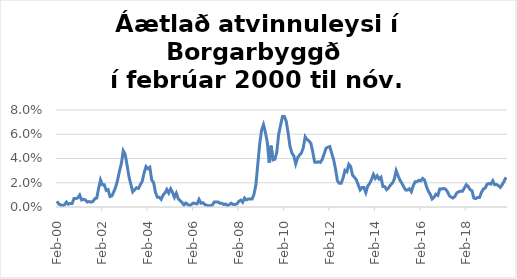
| Category | Series 0 |
|---|---|
| 2000-02-01 | 0.005 |
| 2000-03-01 | 0.002 |
| 2000-04-01 | 0.002 |
| 2000-05-01 | 0.001 |
| 2000-06-01 | 0.002 |
| 2000-07-01 | 0.004 |
| 2000-08-01 | 0.002 |
| 2000-09-01 | 0.003 |
| 2000-10-01 | 0.003 |
| 2000-11-01 | 0.007 |
| 2000-12-01 | 0.007 |
| 2001-01-01 | 0.008 |
| 2001-02-01 | 0.01 |
| 2001-03-01 | 0.006 |
| 2001-04-01 | 0.006 |
| 2001-05-01 | 0.006 |
| 2001-06-01 | 0.004 |
| 2001-07-01 | 0.005 |
| 2001-08-01 | 0.004 |
| 2001-09-01 | 0.005 |
| 2001-10-01 | 0.007 |
| 2001-11-01 | 0.007 |
| 2001-12-01 | 0.015 |
| 2002-01-01 | 0.022 |
| 2002-02-01 | 0.018 |
| 2002-03-01 | 0.018 |
| 2002-04-01 | 0.014 |
| 2002-05-01 | 0.014 |
| 2002-06-01 | 0.009 |
| 2002-07-01 | 0.009 |
| 2002-08-01 | 0.013 |
| 2002-09-01 | 0.017 |
| 2002-10-01 | 0.022 |
| 2002-11-01 | 0.03 |
| 2002-12-01 | 0.036 |
| 2003-01-01 | 0.046 |
| 2003-02-01 | 0.043 |
| 2003-03-01 | 0.035 |
| 2003-04-01 | 0.025 |
| 2003-05-01 | 0.019 |
| 2003-06-01 | 0.013 |
| 2003-07-01 | 0.014 |
| 2003-08-01 | 0.016 |
| 2003-09-01 | 0.015 |
| 2003-10-01 | 0.018 |
| 2003-11-01 | 0.021 |
| 2003-12-01 | 0.028 |
| 2004-01-01 | 0.033 |
| 2004-02-01 | 0.032 |
| 2004-03-01 | 0.033 |
| 2004-04-01 | 0.022 |
| 2004-05-01 | 0.02 |
| 2004-06-01 | 0.012 |
| 2004-07-01 | 0.008 |
| 2004-08-01 | 0.008 |
| 2004-09-01 | 0.006 |
| 2004-10-01 | 0.01 |
| 2004-11-01 | 0.012 |
| 2004-12-01 | 0.014 |
| 2005-01-01 | 0.012 |
| 2005-02-01 | 0.015 |
| 2005-03-01 | 0.012 |
| 2005-04-01 | 0.008 |
| 2005-05-01 | 0.011 |
| 2005-06-01 | 0.007 |
| 2005-07-01 | 0.005 |
| 2005-08-01 | 0.004 |
| 2005-09-01 | 0.002 |
| 2005-10-01 | 0.003 |
| 2005-11-01 | 0.002 |
| 2005-12-01 | 0.001 |
| 2006-01-01 | 0.002 |
| 2006-02-01 | 0.003 |
| 2006-03-01 | 0.003 |
| 2006-04-01 | 0.003 |
| 2006-05-01 | 0.006 |
| 2006-06-01 | 0.003 |
| 2006-07-01 | 0.004 |
| 2006-08-01 | 0.002 |
| 2006-09-01 | 0.002 |
| 2006-10-01 | 0.001 |
| 2006-11-01 | 0.001 |
| 2006-12-01 | 0.002 |
| 2007-01-01 | 0.004 |
| 2007-02-01 | 0.004 |
| 2007-03-01 | 0.004 |
| 2007-04-01 | 0.003 |
| 2007-05-01 | 0.003 |
| 2007-06-01 | 0.002 |
| 2007-07-01 | 0.003 |
| 2007-08-01 | 0.001 |
| 2007-09-01 | 0.002 |
| 2007-10-01 | 0.003 |
| 2007-11-01 | 0.002 |
| 2007-12-01 | 0.002 |
| 2008-01-01 | 0.003 |
| 2008-02-01 | 0.005 |
| 2008-03-01 | 0.006 |
| 2008-04-01 | 0.004 |
| 2008-05-01 | 0.007 |
| 2008-06-01 | 0.006 |
| 2008-07-01 | 0.007 |
| 2008-08-01 | 0.007 |
| 2008-09-01 | 0.007 |
| 2008-10-01 | 0.011 |
| 2008-11-01 | 0.018 |
| 2008-12-01 | 0.035 |
| 2009-01-01 | 0.052 |
| 2009-02-01 | 0.064 |
| 2009-03-01 | 0.068 |
| 2009-04-01 | 0.062 |
| 2009-05-01 | 0.053 |
| 2009-06-01 | 0.037 |
| 2009-07-01 | 0.051 |
| 2009-08-01 | 0.039 |
| 2009-09-01 | 0.039 |
| 2009-10-01 | 0.045 |
| 2009-11-01 | 0.06 |
| 2009-12-01 | 0.067 |
| 2010-01-01 | 0.075 |
| 2010-02-01 | 0.075 |
| 2010-03-01 | 0.071 |
| 2010-04-01 | 0.061 |
| 2010-05-01 | 0.05 |
| 2010-06-01 | 0.044 |
| 2010-07-01 | 0.042 |
| 2010-08-01 | 0.036 |
| 2010-09-01 | 0.041 |
| 2010-10-01 | 0.043 |
| 2010-11-01 | 0.045 |
| 2010-12-01 | 0.049 |
| 2011-01-01 | 0.058 |
| 2011-02-01 | 0.056 |
| 2011-03-01 | 0.055 |
| 2011-04-01 | 0.052 |
| 2011-05-01 | 0.045 |
| 2011-06-01 | 0.037 |
| 2011-07-01 | 0.037 |
| 2011-08-01 | 0.037 |
| 2011-09-01 | 0.037 |
| 2011-10-01 | 0.039 |
| 2011-11-01 | 0.044 |
| 2011-12-01 | 0.048 |
| 2012-01-01 | 0.049 |
| 2012-02-01 | 0.05 |
| 2012-03-01 | 0.044 |
| 2012-04-01 | 0.039 |
| 2012-05-01 | 0.031 |
| 2012-06-01 | 0.022 |
| 2012-07-01 | 0.02 |
| 2012-08-01 | 0.02 |
| 2012-09-01 | 0.024 |
| 2012-10-01 | 0.03 |
| 2012-11-01 | 0.029 |
| 2012-12-01 | 0.035 |
| 2013-01-01 | 0.033 |
| 2013-02-01 | 0.026 |
| 2013-03-01 | 0.024 |
| 2013-04-01 | 0.022 |
| 2013-05-01 | 0.018 |
| 2013-06-01 | 0.014 |
| 2013-07-01 | 0.016 |
| 2013-08-01 | 0.016 |
| 2013-09-01 | 0.012 |
| 2013-10-01 | 0.017 |
| 2013-11-01 | 0.019 |
| 2013-12-01 | 0.023 |
| 2014-01-01 | 0.027 |
| 2014-02-01 | 0.024 |
| 2014-03-01 | 0.026 |
| 2014-04-01 | 0.023 |
| 2014-05-01 | 0.025 |
| 2014-06-01 | 0.017 |
| 2014-07-01 | 0.017 |
| 2014-08-01 | 0.014 |
| 2014-09-01 | 0.016 |
| 2014-10-01 | 0.018 |
| 2014-11-01 | 0.02 |
| 2014-12-01 | 0.023 |
| 2015-01-01 | 0.03 |
| 2015-02-01 | 0.026 |
| 2015-03-01 | 0.022 |
| 2015-04-01 | 0.02 |
| 2015-05-01 | 0.017 |
| 2015-06-01 | 0.014 |
| 2015-07-01 | 0.014 |
| 2015-08-01 | 0.015 |
| 2015-09-01 | 0.013 |
| 2015-10-01 | 0.017 |
| 2015-11-01 | 0.021 |
| 2015-12-01 | 0.021 |
| 2016-01-01 | 0.022 |
| 2016-02-01 | 0.022 |
| 2016-03-01 | 0.024 |
| 2016-04-01 | 0.022 |
| 2016-05-01 | 0.017 |
| 2016-06-01 | 0.013 |
| 2016-07-01 | 0.01 |
| 2016-08-01 | 0.007 |
| 2016-09-01 | 0.008 |
| 2016-10-01 | 0.011 |
| 2016-11-01 | 0.01 |
| 2016-12-01 | 0.015 |
| 2017-01-01 | 0.015 |
| 2017-02-01 | 0.015 |
| 2017-03-01 | 0.015 |
| 2017-04-01 | 0.013 |
| 2017-05-01 | 0.01 |
| 2017-06-01 | 0.008 |
| 2017-07-01 | 0.007 |
| 2017-08-01 | 0.009 |
| 2017-09-01 | 0.012 |
| 2017-10-01 | 0.013 |
| 2017-11-01 | 0.013 |
| 2017-12-01 | 0.013 |
| 2018-01-01 | 0.016 |
| 2018-02-01 | 0.018 |
| 2018-03-01 | 0.017 |
| 2018-04-01 | 0.014 |
| 2018-05-01 | 0.013 |
| 2018-06-01 | 0.007 |
| 2018-07-01 | 0.007 |
| 2018-08-01 | 0.008 |
| 2018-09-01 | 0.008 |
| 2018-10-01 | 0.012 |
| 2018-11-01 | 0.015 |
| 2018-12-01 | 0.016 |
| 2019-01-01 | 0.019 |
| 2019-02-01 | 0.019 |
| 2019-03-01 | 0.019 |
| 2019-04-01 | 0.022 |
| 2019-05-01 | 0.018 |
| 2019-06-01 | 0.019 |
| 2019-07-01 | 0.018 |
| 2019-08-01 | 0.016 |
| 2019-09-01 | 0.018 |
| 2019-10-01 | 0.021 |
| 2019-11-01 | 0.025 |